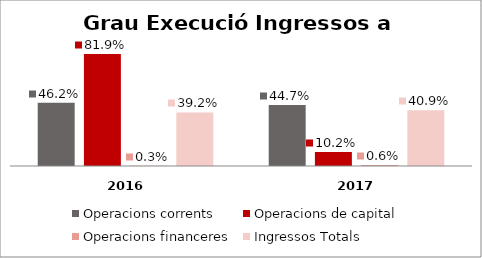
| Category | Operacions corrents | Operacions de capital | Operacions financeres | Ingressos Totals |
|---|---|---|---|---|
| 0 | 0.462 | 0.819 | 0.003 | 0.392 |
| 1 | 0.447 | 0.102 | 0.006 | 0.409 |